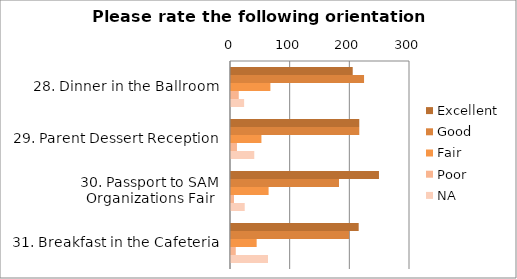
| Category | Excellent | Good | Fair | Poor | NA |
|---|---|---|---|---|---|
| 28. Dinner in the Ballroom | 204 | 223 | 66 | 13 | 22 |
| 29. Parent Dessert Reception | 215 | 215 | 51 | 10 | 39 |
| 30. Passport to SAM Organizations Fair | 248 | 181 | 63 | 5 | 23 |
| 31. Breakfast in the Cafeteria | 214 | 198 | 43 | 8 | 62 |